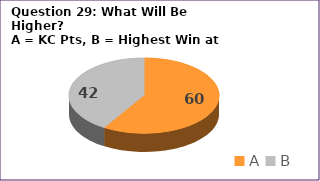
| Category | Series 0 |
|---|---|
| A | 60 |
| B | 42 |